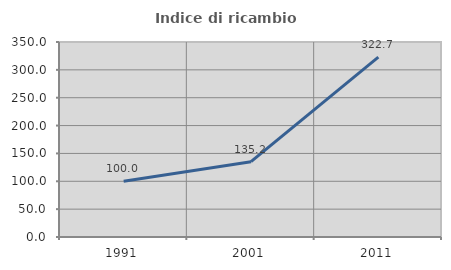
| Category | Indice di ricambio occupazionale  |
|---|---|
| 1991.0 | 100 |
| 2001.0 | 135.227 |
| 2011.0 | 322.727 |